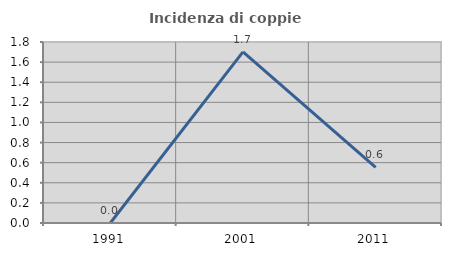
| Category | Incidenza di coppie miste |
|---|---|
| 1991.0 | 0 |
| 2001.0 | 1.701 |
| 2011.0 | 0.554 |